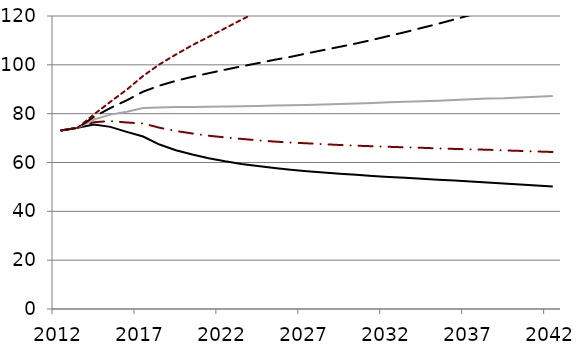
| Category | Series 0 | Series 1 | Series 2 | Series 3 | 90th rrrrrrrrrrrr - 7.00% |
|---|---|---|---|---|---|
| 2012.0 | 73.14 | 73.14 | 73.14 | 73.14 | 73.14 |
| 2013.0 | 74.192 | 74.192 | 74.192 | 74.192 | 74.192 |
| 2014.0 | 75.513 | 76.511 | 77.607 | 78.702 | 79.695 |
| 2015.0 | 74.597 | 76.96 | 79.617 | 82.317 | 84.846 |
| 2016.0 | 72.549 | 76.385 | 80.808 | 85.463 | 89.82 |
| 2017.0 | 70.639 | 75.981 | 82.305 | 89.017 | 95.465 |
| 2018.0 | 67.354 | 74.24 | 82.53 | 91.485 | 100.2 |
| 2019.0 | 64.995 | 72.901 | 82.685 | 93.448 | 104.23 |
| 2020.0 | 63.245 | 71.882 | 82.758 | 95.095 | 108.04 |
| 2021.0 | 61.756 | 70.968 | 82.798 | 96.561 | 111.47 |
| 2022.0 | 60.512 | 70.284 | 82.943 | 97.989 | 114.97 |
| 2023.0 | 59.431 | 69.671 | 83.035 | 99.382 | 118.46 |
| 2024.0 | 58.553 | 69.087 | 83.19 | 100.67 | 121.87 |
| 2025.0 | 57.762 | 68.578 | 83.333 | 102.04 | 125.27 |
| 2026.0 | 57.074 | 68.181 | 83.474 | 103.27 | 128.68 |
| 2027.0 | 56.46 | 67.86 | 83.597 | 104.69 | 132.28 |
| 2028.0 | 55.881 | 67.503 | 83.758 | 106.05 | 135.98 |
| 2029.0 | 55.396 | 67.164 | 83.974 | 107.38 | 139.42 |
| 2030.0 | 55.029 | 66.884 | 84.202 | 108.75 | 143.16 |
| 2031.0 | 54.504 | 66.658 | 84.355 | 110.24 | 147.2 |
| 2032.0 | 54.101 | 66.427 | 84.652 | 111.84 | 151.15 |
| 2033.0 | 53.751 | 66.216 | 84.842 | 113.42 | 155.34 |
| 2034.0 | 53.384 | 66.019 | 85.056 | 115.11 | 159.63 |
| 2035.0 | 52.976 | 65.774 | 85.293 | 116.8 | 164.07 |
| 2036.0 | 52.62 | 65.557 | 85.574 | 118.61 | 168.66 |
| 2037.0 | 52.185 | 65.373 | 85.863 | 120.44 | 173.65 |
| 2038.0 | 51.779 | 65.236 | 86.182 | 122.22 | 178.82 |
| 2039.0 | 51.39 | 64.959 | 86.326 | 124.44 | 184.4 |
| 2040.0 | 50.998 | 64.749 | 86.633 | 126.47 | 190.29 |
| 2041.0 | 50.578 | 64.513 | 86.908 | 128.82 | 197 |
| 2042.0 | 50.132 | 64.298 | 87.211 | 131.18 | 203.56 |